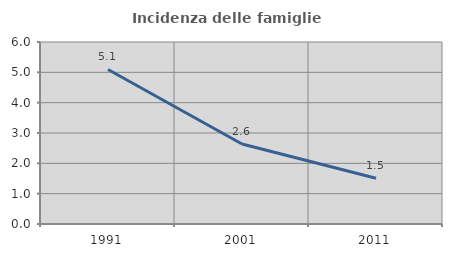
| Category | Incidenza delle famiglie numerose |
|---|---|
| 1991.0 | 5.094 |
| 2001.0 | 2.638 |
| 2011.0 | 1.509 |